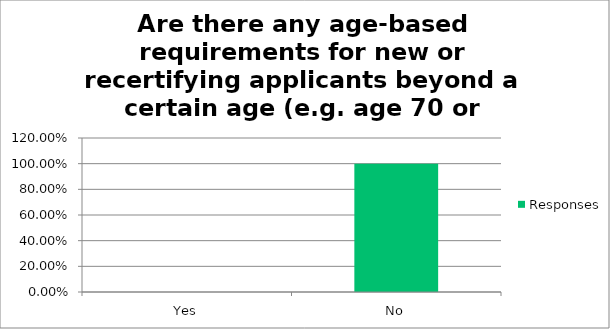
| Category | Responses |
|---|---|
| Yes | 0 |
| No | 1 |